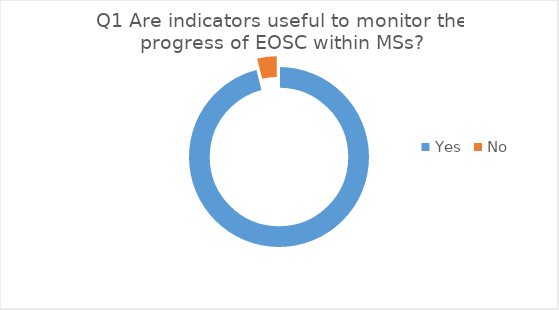
| Category | Series 0 |
|---|---|
| Yes | 50 |
| No | 2 |